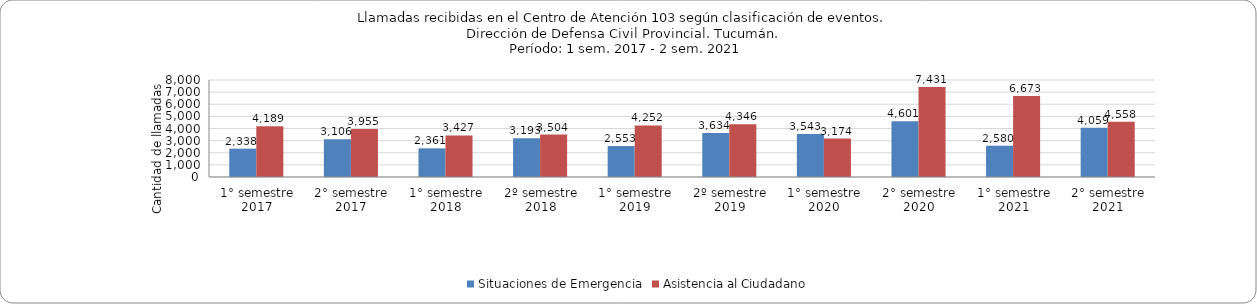
| Category | Situaciones de Emergencia | Asistencia al Ciudadano |
|---|---|---|
| 1° semestre
2017 | 2338 | 4189 |
| 2° semestre
2017 | 3106 | 3955 |
| 1° semestre
2018 | 2361 | 3427 |
| 2º semestre
2018 | 3193 | 3504 |
| 1° semestre
2019 | 2553 | 4252 |
| 2º semestre
2019 | 3634 | 4346 |
| 1° semestre
2020 | 3543 | 3174 |
| 2° semestre
2020 | 4601 | 7431 |
| 1° semestre
2021 | 2580 | 6673 |
| 2° semestre
2021 | 4059 | 4558 |